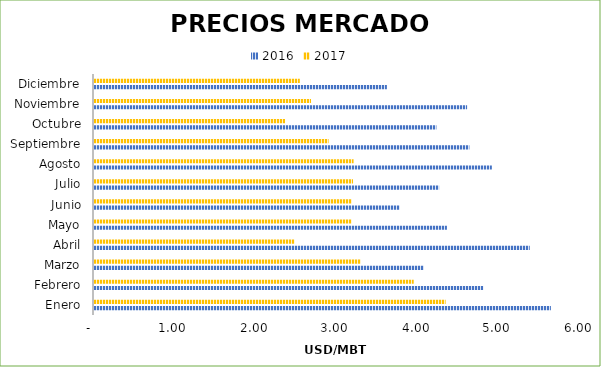
| Category | 2016 | 2017 |
|---|---|---|
| Enero | 5.64 | 4.341 |
| Febrero | 4.807 | 3.947 |
| Marzo | 4.073 | 3.295 |
| Abril | 5.38 | 2.476 |
| Mayo | 4.357 | 3.181 |
| Junio | 3.775 | 3.184 |
| Julio | 4.261 | 3.198 |
| Agosto | 4.912 | 3.205 |
| Septiembre | 4.635 | 2.896 |
| Octubre | 4.227 | 2.359 |
| Noviembre | 4.606 | 2.679 |
| Diciembre | 3.616 | 2.541 |